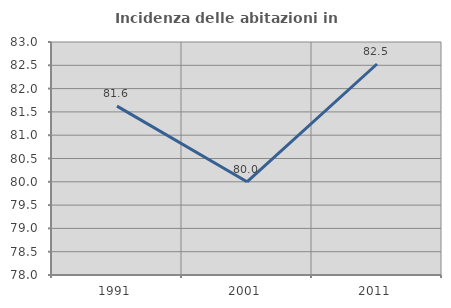
| Category | Incidenza delle abitazioni in proprietà  |
|---|---|
| 1991.0 | 81.624 |
| 2001.0 | 80 |
| 2011.0 | 82.528 |